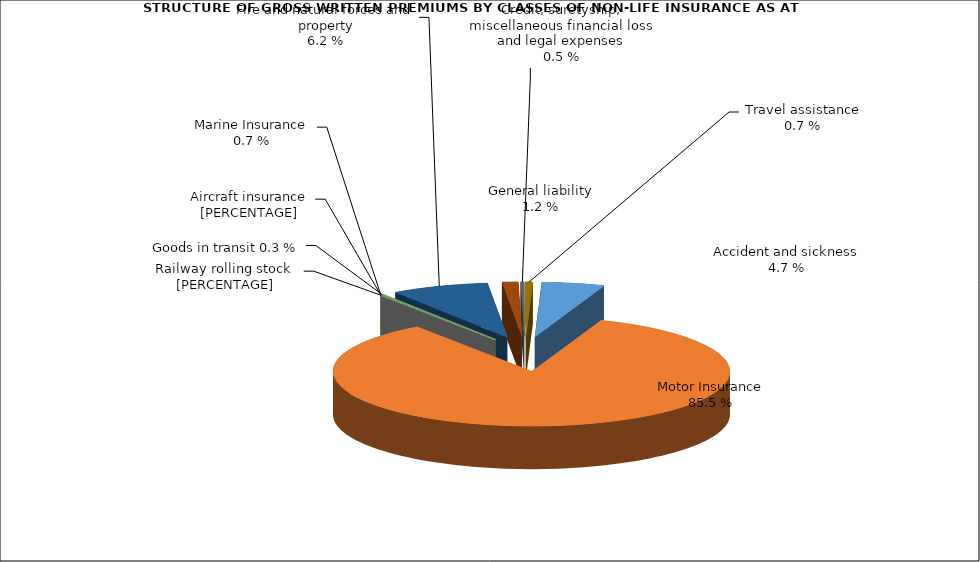
| Category | Series 1 | Злополука и заболяване МПС Релсови превозни средства Летателни апарати Плаванелни съдове Товари по време на превоз Пожар и природни бедствия и други щети на имущество Обща гражданска отговорност Кредити, гаранции, разни финансови загуби и правни разноски |
|---|---|---|
| Злополука и заболяване | 0.051 | 0.072 |
| МПС | 0.846 | 0.632 |
| Релсови превозни средства | 0 | 0 |
| Летателни апарати | 0 | 0.007 |
| Плаванелни съдове | 0 | 0.003 |
| Товари по време на превоз | 0.002 | 0.01 |
| Пожар и природни бедствия и други щети на имущество | 0.079 | 0.21 |
| Обща гражданска отговорност | 0.013 | 0.03 |
| Кредити, гаранции, разни финансови загуби и правни разноски | 0.003 | 0.027 |
| Помощ при пътуване | 0.006 | 0.009 |